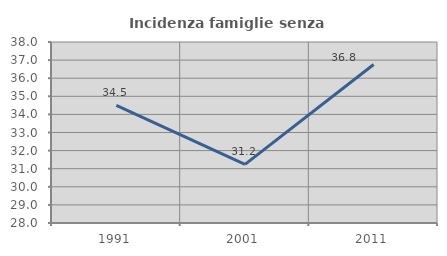
| Category | Incidenza famiglie senza nuclei |
|---|---|
| 1991.0 | 34.495 |
| 2001.0 | 31.24 |
| 2011.0 | 36.758 |